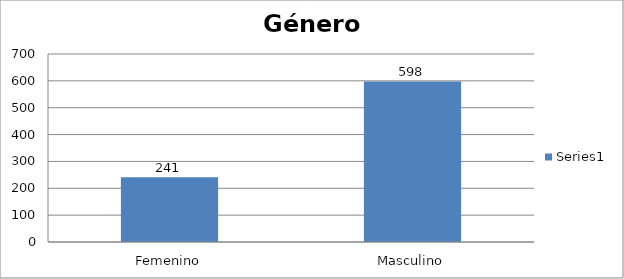
| Category | Series 0 |
|---|---|
| Femenino | 241 |
| Masculino | 598 |